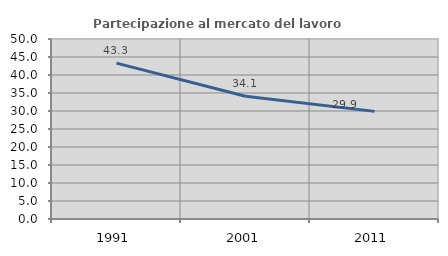
| Category | Partecipazione al mercato del lavoro  femminile |
|---|---|
| 1991.0 | 43.289 |
| 2001.0 | 34.095 |
| 2011.0 | 29.896 |